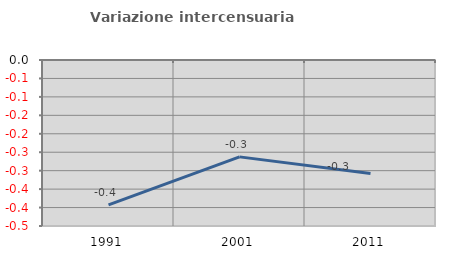
| Category | Variazione intercensuaria annua |
|---|---|
| 1991.0 | -0.393 |
| 2001.0 | -0.263 |
| 2011.0 | -0.308 |